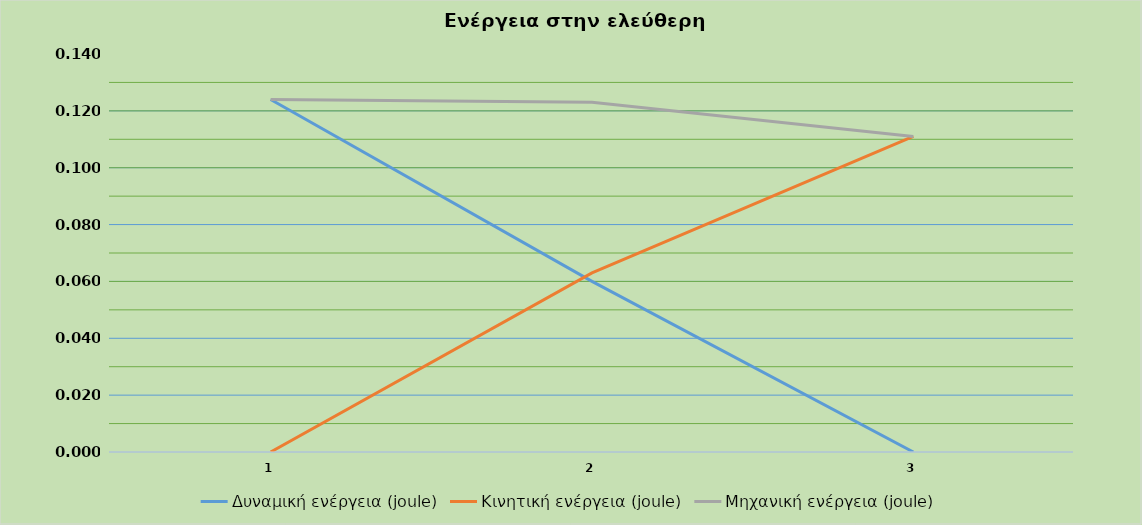
| Category | Δυναμική ενέργεια (joule) | Κινητική ενέργεια (joule) | Μηχανική ενέργεια (joule) |
|---|---|---|---|
| 0 | 0.124 | 0 | 0.124 |
| 1 | 0.06 | 0.063 | 0.123 |
| 2 | 0 | 0.111 | 0.111 |